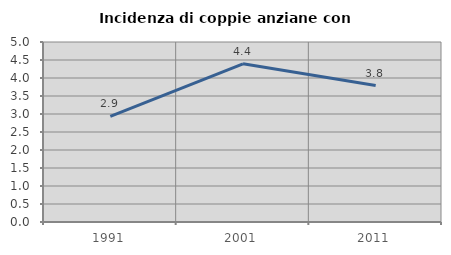
| Category | Incidenza di coppie anziane con figli |
|---|---|
| 1991.0 | 2.933 |
| 2001.0 | 4.393 |
| 2011.0 | 3.789 |